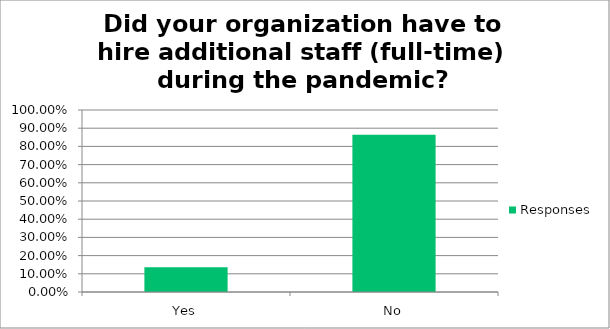
| Category | Responses |
|---|---|
| Yes | 0.136 |
| No | 0.863 |